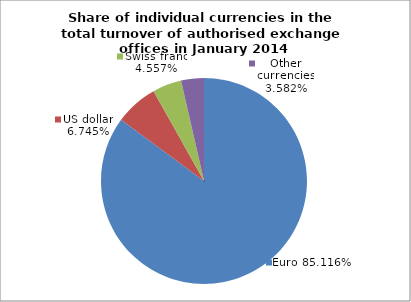
| Category | EUR |
|---|---|
| 0 | 0.851 |
| 1 | 0.067 |
| 2 | 0.046 |
| 3 | 0.036 |